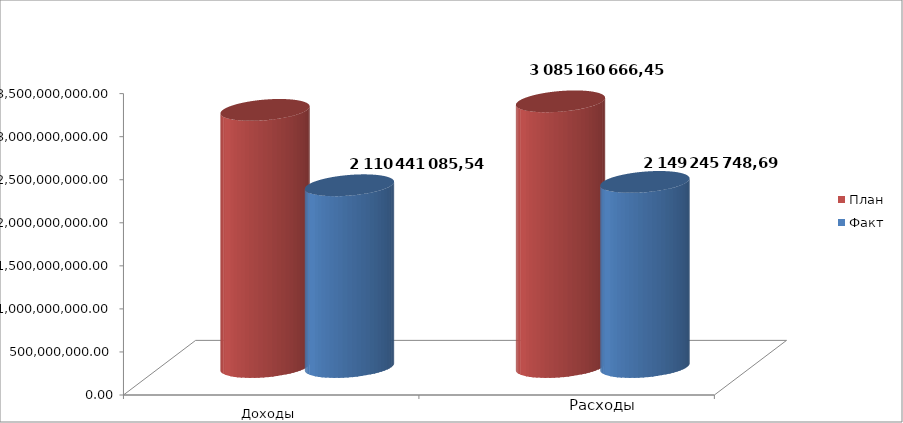
| Category | План | Факт |
|---|---|---|
| 0 | 2985738250.1 | 2110441085.54 |
| 1 | 3085160666.45 | 2149245748.69 |